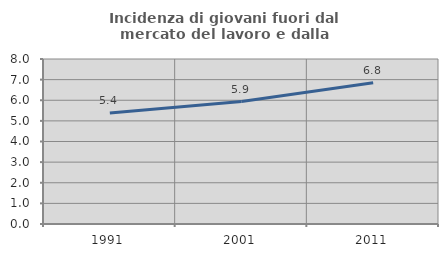
| Category | Incidenza di giovani fuori dal mercato del lavoro e dalla formazione  |
|---|---|
| 1991.0 | 5.38 |
| 2001.0 | 5.935 |
| 2011.0 | 6.844 |